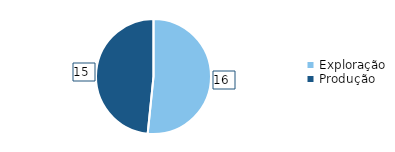
| Category | Num. |
|---|---|
| Exploração | 16 |
| Produção | 15 |